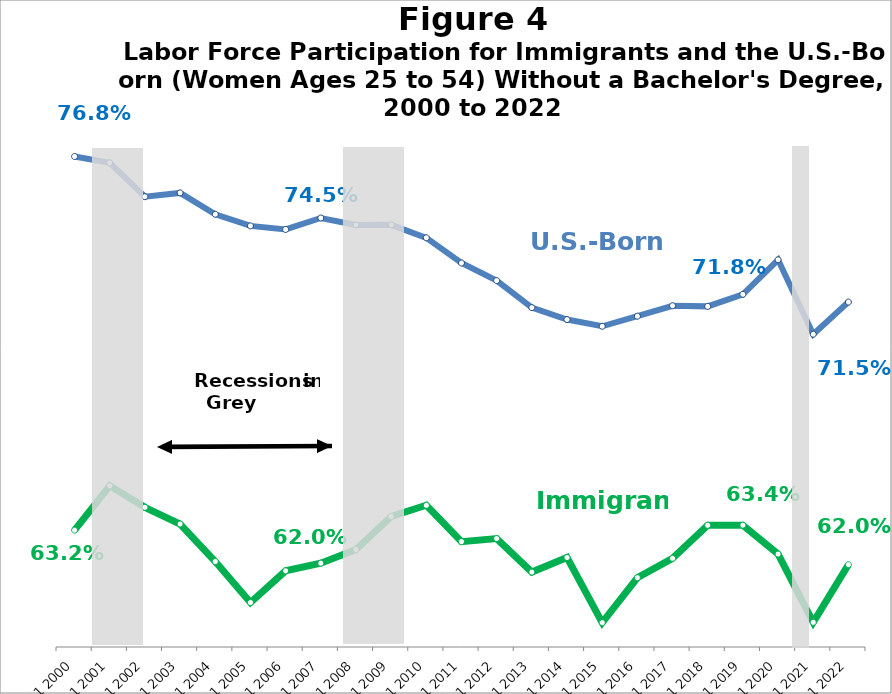
| Category | Native | Immigrant |
|---|---|---|
| Q1 2000 | 0.768 | 0.632 |
| Q1 2001 | 0.765 | 0.648 |
| Q1 2002 | 0.753 | 0.641 |
| Q1 2003 | 0.754 | 0.635 |
| Q1 2004 | 0.747 | 0.621 |
| Q1 2005 | 0.743 | 0.606 |
| Q1 2006 | 0.741 | 0.618 |
| Q1 2007 | 0.745 | 0.62 |
| Q1 2008 | 0.743 | 0.625 |
| Q1 2009 | 0.743 | 0.637 |
| Q1 2010 | 0.738 | 0.641 |
| Q1 2011 | 0.729 | 0.628 |
| Q1 2012 | 0.723 | 0.629 |
| Q1 2013 | 0.713 | 0.617 |
| Q1 2014 | 0.709 | 0.622 |
| Q1 2015 | 0.706 | 0.599 |
| Q1 2016 | 0.71 | 0.615 |
| Q1 2017 | 0.714 | 0.622 |
| Q1 2018 | 0.713 | 0.634 |
| Q1 2019 | 0.718 | 0.634 |
| Q1 2020 | 0.73 | 0.624 |
| Q1 2021 | 0.703 | 0.599 |
| Q1 2022 | 0.715 | 0.62 |